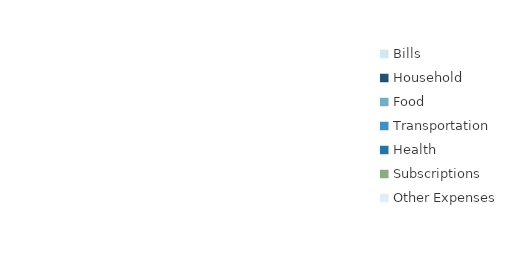
| Category | Series 0 |
|---|---|
| Bills | 0 |
| Household | 0 |
| Food | 0 |
| Transportation | 0 |
| Health | 0 |
| Subscriptions | 0 |
| Other Expenses | 0 |